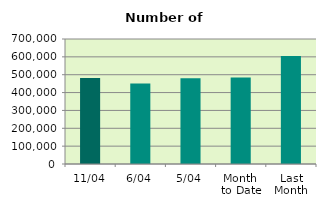
| Category | Series 0 |
|---|---|
| 11/04 | 481636 |
| 6/04 | 451328 |
| 5/04 | 480398 |
| Month 
to Date | 485034.4 |
| Last
Month | 605064 |